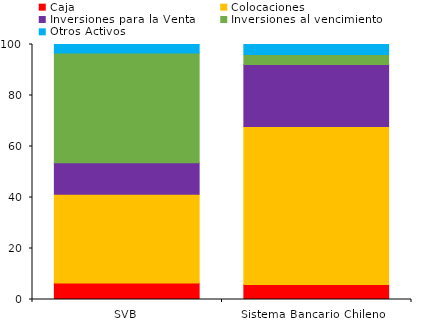
| Category | Caja | Colocaciones | Inversiones para la Venta | Inversiones al vencimiento | Otros Activos |
|---|---|---|---|---|---|
| SVB | 6.516 | 34.75 | 12.323 | 43.107 | 3.305 |
| Sistema Bancario Chileno | 5.909 | 61.905 | 24.372 | 3.939 | 3.874 |